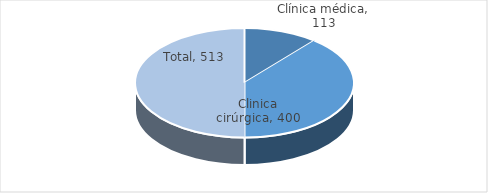
| Category | Series 0 |
|---|---|
| Clínica médica | 113 |
| Clinica cirúrgica | 400 |
| Total | 513 |